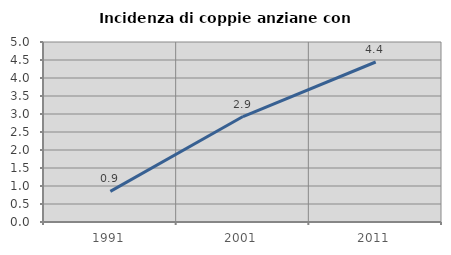
| Category | Incidenza di coppie anziane con figli |
|---|---|
| 1991.0 | 0.851 |
| 2001.0 | 2.929 |
| 2011.0 | 4.444 |